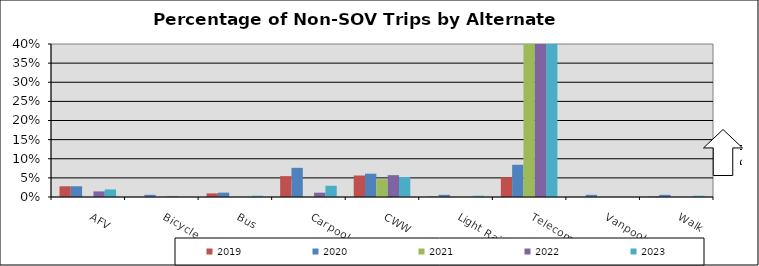
| Category | 2019 | 2020 | 2021 | 2022 | 2023 |
|---|---|---|---|---|---|
| AFV | 0.028 | 0.028 | 0 | 0.015 | 0.02 |
| Bicycle | 0 | 0.006 | 0 | 0.002 | 0 |
| Bus | 0.009 | 0.011 | 0 | 0 | 0.003 |
| Carpool | 0.055 | 0.076 | 0 | 0.011 | 0.029 |
| CWW | 0.056 | 0.061 | 0.046 | 0.057 | 0.052 |
| Light Rail | 0.001 | 0.006 | 0 | 0 | 0.003 |
| Telecommute | 0.051 | 0.084 | 0.85 | 0.584 | 0.49 |
| Vanpool | 0 | 0.006 | 0 | 0 | 0 |
| Walk | 0.001 | 0.006 | 0 | 0 | 0.003 |